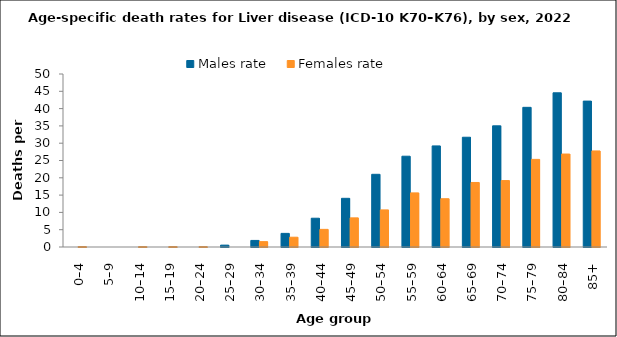
| Category | Males rate | Females rate |
|---|---|---|
| 0–4 | 0 | 0.136 |
| 5–9 | 0 | 0 |
| 10–14 | 0 | 0.126 |
| 15–19 | 0 | 0.135 |
| 20–24 | 0 | 0.126 |
| 25–29 | 0.541 | 0 |
| 30–34 | 1.9 | 1.55 |
| 35–39 | 3.935 | 2.83 |
| 40–44 | 8.316 | 5.098 |
| 45–49 | 14.071 | 8.421 |
| 50–54 | 21.01 | 10.717 |
| 55–59 | 26.242 | 15.635 |
| 60–64 | 29.22 | 13.952 |
| 65–69 | 31.722 | 18.649 |
| 70–74 | 35.017 | 19.2 |
| 75–79 | 40.366 | 25.321 |
| 80–84 | 44.566 | 26.869 |
| 85+ | 42.165 | 27.764 |